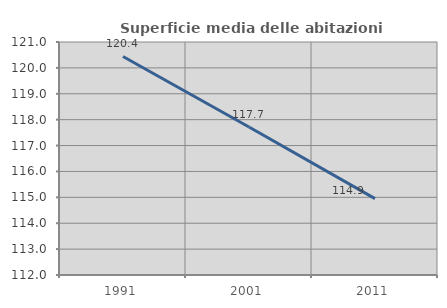
| Category | Superficie media delle abitazioni occupate |
|---|---|
| 1991.0 | 120.441 |
| 2001.0 | 117.717 |
| 2011.0 | 114.948 |